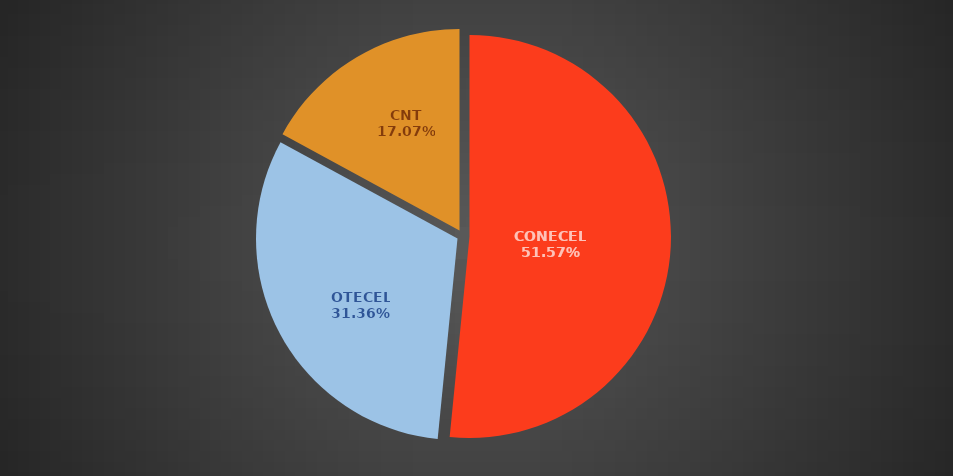
| Category | May 2022 |
|---|---|
| CONECEL | 8810418 |
| OTECEL | 5358332 |
| CNT | 2916052 |